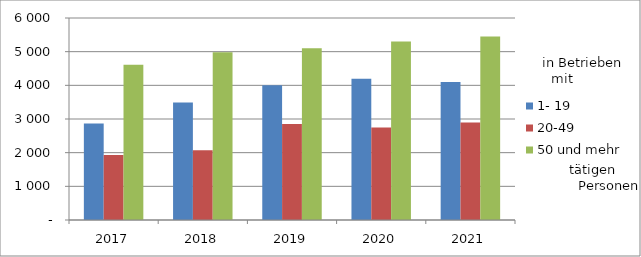
| Category | 1- 19 | 20-49 | 50 und mehr |
|---|---|---|---|
| 2017.0 | 2864 | 1931 | 4609 |
| 2018.0 | 3488 | 2071 | 4982 |
| 2019.0 | 4006 | 2850 | 5103 |
| 2020.0 | 4199 | 2746 | 5303 |
| 2021.0 | 4101 | 2897 | 5447 |